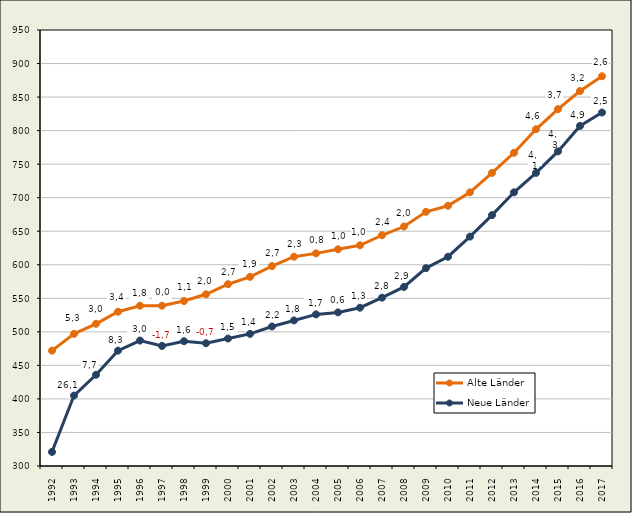
| Category | Alte Länder | Neue Länder |
|---|---|---|
| 1992.0 | 472 | 321 |
| 1993.0 | 497 | 405 |
| 1994.0 | 512 | 436 |
| 1995.0 | 530 | 472 |
| 1996.0 | 539 | 487 |
| 1997.0 | 539 | 479 |
| 1998.0 | 546 | 486 |
| 1999.0 | 556 | 483 |
| 2000.0 | 571 | 490 |
| 2001.0 | 582 | 497 |
| 2002.0 | 598 | 508 |
| 2003.0 | 612 | 517 |
| 2004.0 | 617 | 526 |
| 2005.0 | 623 | 529 |
| 2006.0 | 629 | 536 |
| 2007.0 | 644 | 551 |
| 2008.0 | 657 | 567 |
| 2009.0 | 679 | 595 |
| 2010.0 | 688 | 612 |
| 2011.0 | 708 | 642 |
| 2012.0 | 737 | 674 |
| 2013.0 | 767 | 708 |
| 2014.0 | 802 | 737 |
| 2015.0 | 832 | 769 |
| 2016.0 | 859 | 807 |
| 2017.0 | 881 | 827 |